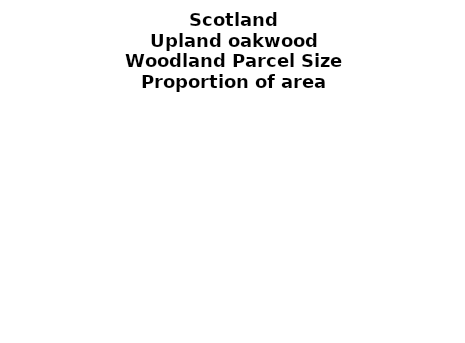
| Category | Upland oakwood |
|---|---|
| <5 ha | 0.065 |
| ≥5 and <10 ha | 0.056 |
| ≥10 and <15 ha | 0.027 |
| ≥15 and <20 ha | 0.019 |
| ≥20 and <25 ha | 0.069 |
| ≥25 and <30 ha | 0.034 |
| ≥30 and <35 ha | 0.01 |
| ≥35 and <40 ha | 0.009 |
| ≥40 and <45 ha | 0.01 |
| ≥45 and <50 ha | 0.015 |
| ≥50 and <60 ha | 0.032 |
| ≥60 and <70 ha | 0.026 |
| ≥70 and <80 ha | 0.012 |
| ≥80 and <90 ha | 0.008 |
| ≥90 and <100 ha | 0.036 |
| ≥100 and <150 ha | 0.081 |
| ≥150 and <200 ha | 0.032 |
| ≥200 ha | 0.458 |